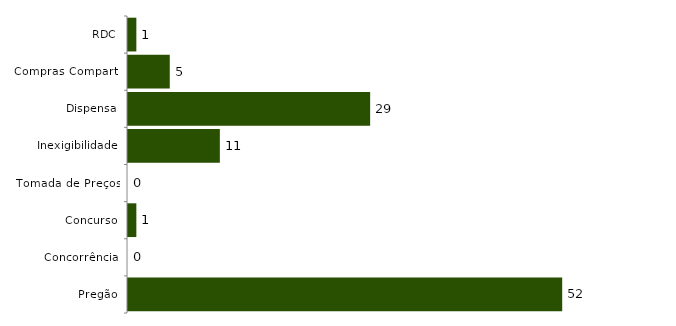
| Category | Series 0 |
|---|---|
| Pregão | 52 |
| Concorrência | 0 |
| Concurso | 1 |
| Tomada de Preços | 0 |
| Inexigibilidade | 11 |
| Dispensa | 29 |
| Compras Compart. | 5 |
| RDC | 1 |